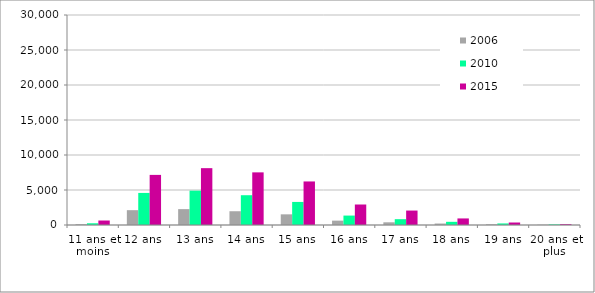
| Category | 2006 | 2010 | 2015 |
|---|---|---|---|
| 11 ans et moins | 114.165 | 247 | 641 |
| 12 ans | 2117.836 | 4582 | 7158 |
| 13 ans | 2267.591 | 4906 | 8120 |
| 14 ans | 1966.694 | 4255 | 7519 |
| 15 ans | 1523.437 | 3296 | 6221 |
| 16 ans | 622.594 | 1347 | 2928 |
| 17 ans | 385.019 | 833 | 2063 |
| 18 ans | 210.305 | 455 | 938 |
| 19 ans | 103.535 | 224 | 356 |
| 20 ans et plus | 38.825 | 84 | 116 |